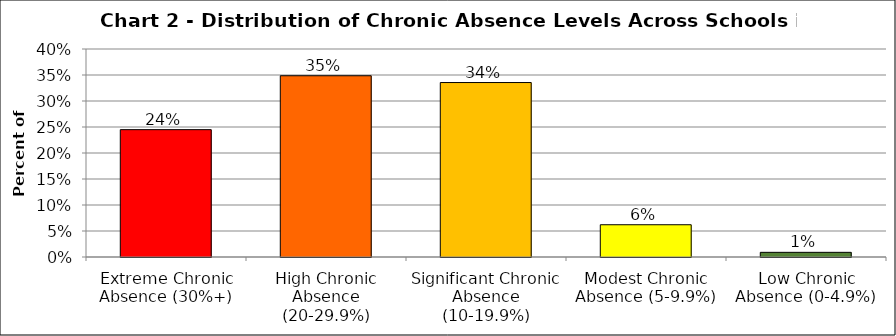
| Category | Series 1 |
|---|---|
| Extreme Chronic Absence (30%+) | 0.245 |
| High Chronic Absence (20-29.9%) | 0.349 |
| Significant Chronic Absence (10-19.9%) | 0.336 |
| Modest Chronic Absence (5-9.9%) | 0.062 |
| Low Chronic Absence (0-4.9%) | 0.009 |